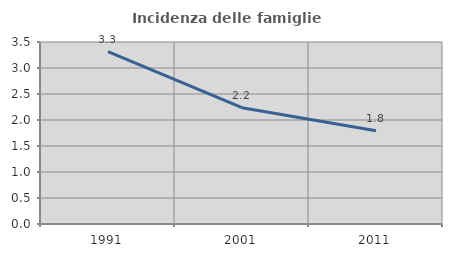
| Category | Incidenza delle famiglie numerose |
|---|---|
| 1991.0 | 3.315 |
| 2001.0 | 2.237 |
| 2011.0 | 1.795 |